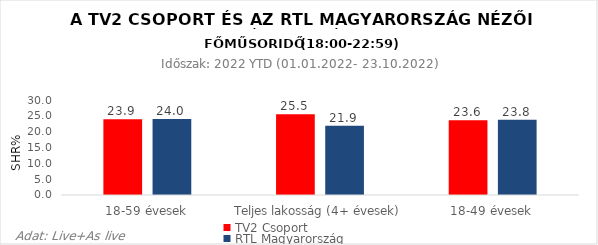
| Category | TV2 Csoport | RTL Magyarország |
|---|---|---|
| 18-59 évesek | 23.9 | 24 |
| Teljes lakosság (4+ évesek) | 25.5 | 21.9 |
| 18-49 évesek | 23.6 | 23.8 |